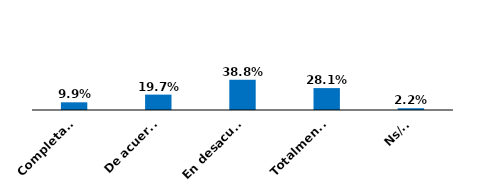
| Category | Series 0 |
|---|---|
| Completamente de acuerdo | 0.099 |
| De acuerdo | 0.197 |
| En desacuerdo | 0.388 |
| Totalmente en desacuerdo | 0.281 |
| Ns/Nr | 0.022 |